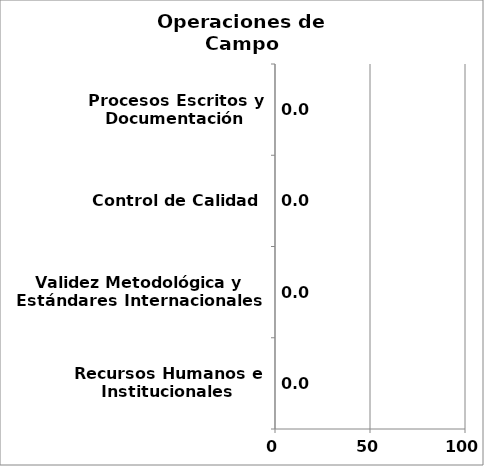
| Category | Series 0 |
|---|---|
| Recursos Humanos e Institucionales | 0 |
| Validez Metodológica y Estándares Internacionales | 0 |
| Control de Calidad | 0 |
| Procesos Escritos y Documentación | 0 |